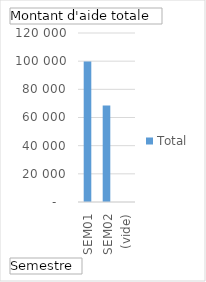
| Category | Total |
|---|---|
| SEM01 | 99770 |
| SEM02 | 68520 |
| (vide) | 0 |